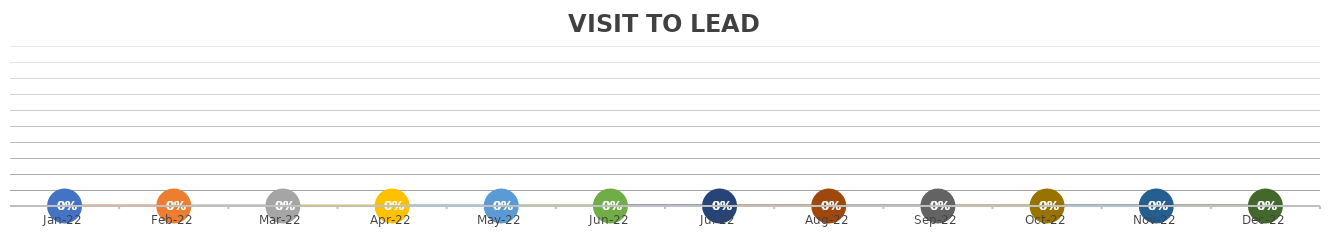
| Category | VISIT TO LEAD % |
|---|---|
| 2022-01-18 | 0 |
| 2022-02-18 | 0 |
| 2022-03-18 | 0 |
| 2022-04-18 | 0 |
| 2022-05-18 | 0 |
| 2022-06-18 | 0 |
| 2022-07-18 | 0 |
| 2022-08-18 | 0 |
| 2022-09-18 | 0 |
| 2022-10-18 | 0 |
| 2022-11-18 | 0 |
| 2022-12-18 | 0 |